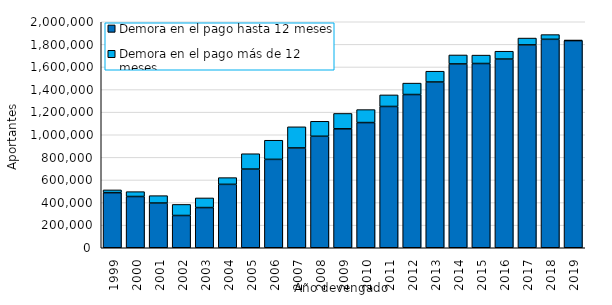
| Category | Demora en el pago hasta 12 meses | Demora en el pago más de 12 meses |
|---|---|---|
| 1999.0 | 487643 | 24283.5 |
| 2000.0 | 453460 | 42994.167 |
| 2001.0 | 395655 | 65403.417 |
| 2002.0 | 285478 | 98075.5 |
| 2003.0 | 355518 | 85359.417 |
| 2004.0 | 561001 | 59648.917 |
| 2005.0 | 696183 | 135836.917 |
| 2006.0 | 782082 | 169405.167 |
| 2007.0 | 883295 | 187040 |
| 2008.0 | 986462 | 132864.583 |
| 2009.0 | 1052446 | 136243.333 |
| 2010.0 | 1107823 | 114813.083 |
| 2011.0 | 1250360 | 102323.5 |
| 2012.0 | 1355944 | 101141.75 |
| 2013.0 | 1466818 | 95607.583 |
| 2014.0 | 1626777 | 79259.667 |
| 2015.0 | 1630476 | 74319.083 |
| 2016.0 | 1669817 | 69425.083 |
| 2017.0 | 1795109 | 60605.833 |
| 2018.0 | 1844690 | 41665.25 |
| 2019.0 | 1833347 | 3804.667 |